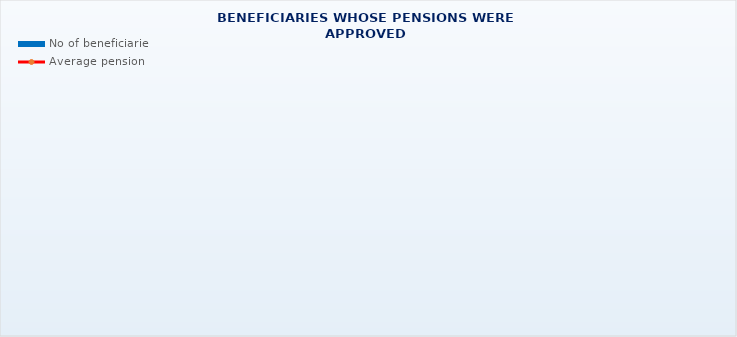
| Category | No of beneficiaries |
|---|---|
| Authorised officials in internal affairs, judicial officers and workers engaged in demining work: | 17264 |
| Pension beneficiaries entitled under the Fire Services Act (Official Gazette 125/19) | 299 |
| Active military personnel - DVO  | 16084 |
| Croatian Homeland Army veterans mobilised from 1941 to 1945 | 2283 |
| Former political prisoners | 2246 |
| Croatian Veterans from the Homeland War - ZOHBDR (Act on Croatian Homeland War Veterans and Their Family Members) | 71177 |
| Pensions approved under general regulations and determined according to the Act on the Rights of Croatian Homeland War Veterans and their Family Members (ZOHBDR), in 2017 (Art. 27, 35, 48 and 49, paragraph 2)    | 54866 |
| Former Yugoslav People's Army members - JNA   | 4038 |
| Former Yugoslav People's Army members - JNA - Art. 185 of Pension Insurance Act (ZOMO)  | 159 |
| National Liberation War veterans - NOR | 5799 |
| Members of the Croatian Parliament, members of the Government, judges of the Constitutional Court and the Auditor General | 686 |
| Members of the Parliamentary Executive Council and administratively retired federal civil servants  (relates to the former SFRY) | 70 |
| Former officials of federal bodies o the former SFRJ -  Article 38 of the Pension Insurance Act (ZOMO) | 21 |
| Full members of the Croatian Academy of Sciences and Arts - HAZU | 127 |
| Miners from the Istrian coal mines "Tupljak" d.d. Labin  | 246 |
| Workers professionally exposed to asbestos | 833 |
| Insurees - crew members on a ship in international and national navigation  - Article  129, paragraph 2 of the Maritime Code | 204 |
| Members of the Croatian Defence Council - HVO  | 6767 |